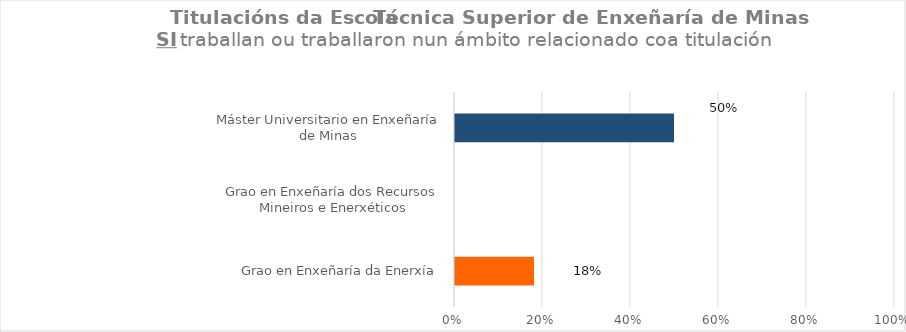
| Category | Series 1 |
|---|---|
| Grao en Enxeñaría da Enerxía | 0.182 |
| Grao en Enxeñaría dos Recursos Mineiros e Enerxéticos | 0 |
| Máster Universitario en Enxeñaría de Minas | 0.5 |